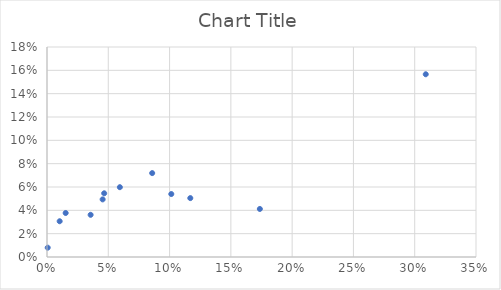
| Category | Series 0 |
|---|---|
| 0.3090090604764493 | 0.157 |
| 0.11691367428068145 | 0.05 |
| 0.10141014627262293 | 0.054 |
| 0.0858148374750864 | 0.072 |
| 0.05943465040550117 | 0.06 |
| 0.04665842334250383 | 0.055 |
| 0.04539650438280028 | 0.049 |
| 0.03559255002220266 | 0.036 |
| 0.015223469498474178 | 0.038 |
| 0.010329218762187545 | 0.031 |
| 0.0005693820624213725 | 0.008 |
| 0.17364808301906887 | 0.041 |